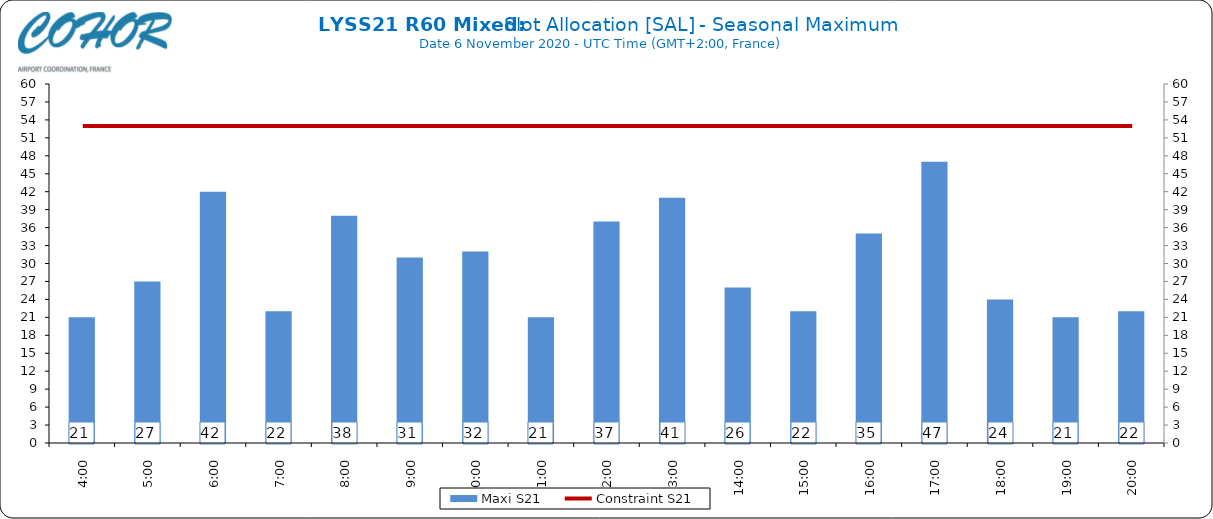
| Category | Maxi S21 |
|---|---|
| 4:00 | 21 |
| 5:00 | 27 |
| 6:00 | 42 |
| 7:00 | 22 |
| 8:00 | 38 |
| 9:00 | 31 |
| 10:00 | 32 |
| 11:00 | 21 |
| 12:00 | 37 |
| 13:00 | 41 |
| 14:00 | 26 |
| 15:00 | 22 |
| 16:00 | 35 |
| 17:00 | 47 |
| 18:00 | 24 |
| 19:00 | 21 |
| 20:00 | 22 |